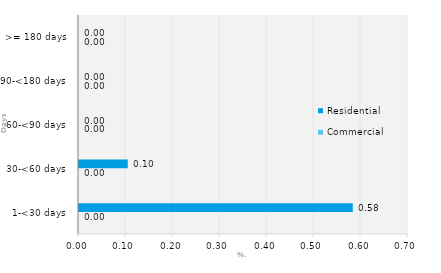
| Category | Commercial | Residential |
|---|---|---|
| 1-<30 days | 0 | 0.583 |
| 30-<60 days | 0 | 0.104 |
| 60-<90 days | 0 | 0 |
| 90-<180 days | 0 | 0 |
| >= 180 days | 0 | 0 |